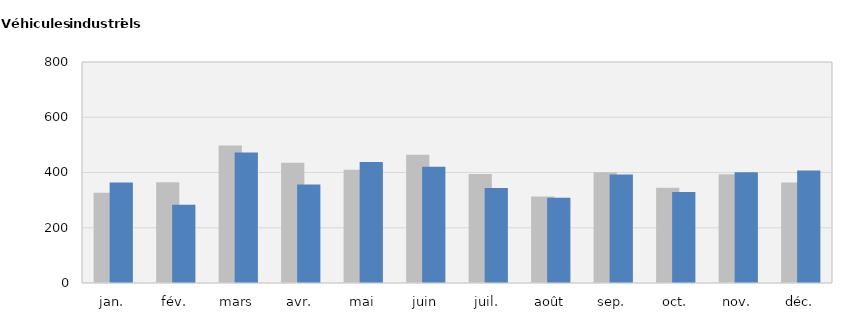
| Category | 2021 | 2022 |
|---|---|---|
| jan. | 327 | 364 |
| fév. | 365 | 283 |
| mars | 498 | 472 |
| avr. | 435 | 357 |
| mai | 410 | 438 |
| juin | 464 | 421 |
| juil. | 395 | 344 |
| août | 313 | 309 |
| sep. | 401 | 393 |
| oct. | 345 | 329 |
| nov. | 394 | 401 |
| déc. | 364 | 407 |